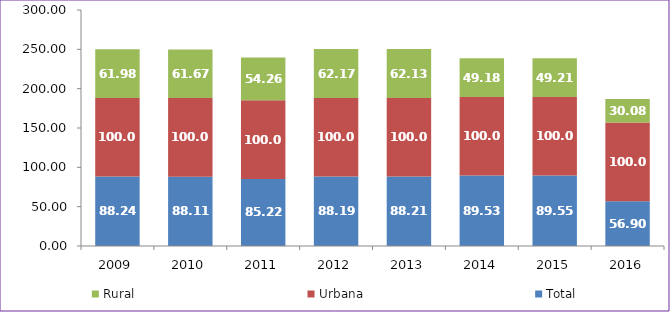
| Category | Total | Urbana | Rural |
|---|---|---|---|
| 2009.0 | 88.24 | 100 | 61.98 |
| 2010.0 | 88.11 | 100 | 61.67 |
| 2011.0 | 85.22 | 100 | 54.26 |
| 2012.0 | 88.19 | 100 | 62.17 |
| 2013.0 | 88.21 | 100 | 62.13 |
| 2014.0 | 89.53 | 100 | 49.18 |
| 2015.0 | 89.55 | 100 | 49.21 |
| 2016.0 | 56.9 | 100 | 30.08 |